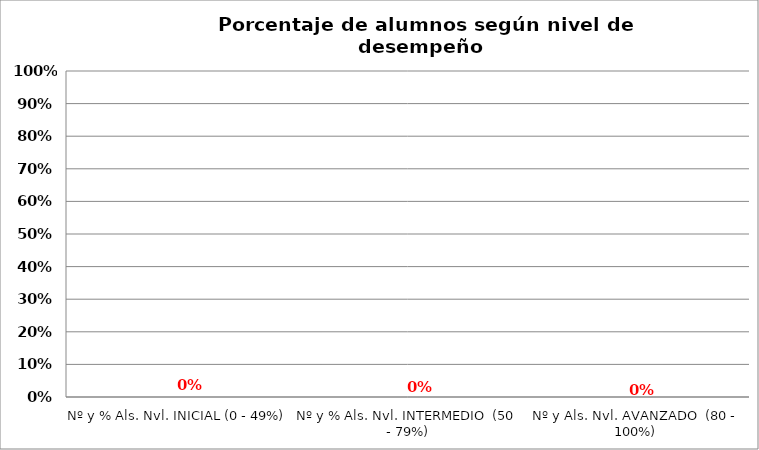
| Category | Series 0 | Series 1 | Series 2 | Series 3 |
|---|---|---|---|---|
| Nº y % Als. Nvl. INICIAL (0 - 49%) |  |  |  | 0 |
| Nº y % Als. Nvl. INTERMEDIO  (50 - 79%) |  |  |  | 0 |
| Nº y Als. Nvl. AVANZADO  (80 - 100%) |  |  |  | 0 |